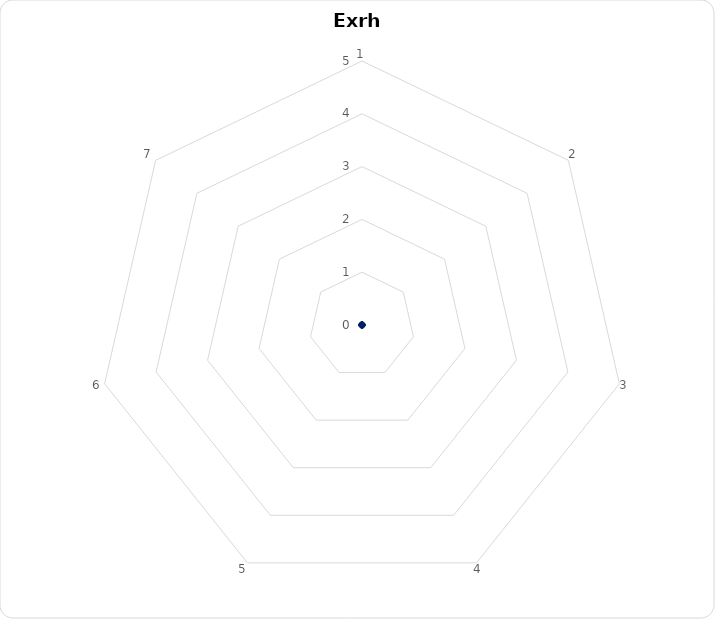
| Category | Series 0 |
|---|---|
| 1.0 | 0 |
| 2.0 | 0 |
| 3.0 | 0 |
| 4.0 | 0 |
| 5.0 | 0 |
| 6.0 | 0 |
| 7.0 | 0 |